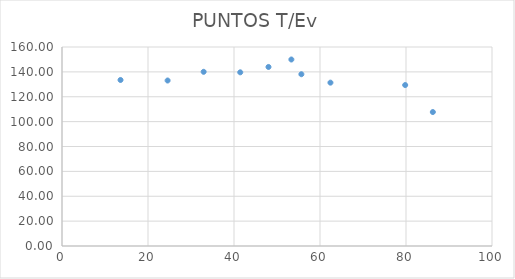
| Category | Series 0 |
|---|---|
| 55.67 | 138.109 |
| 32.94 | 140.046 |
| 53.34000000000001 | 149.946 |
| 79.81 | 129.409 |
| 62.42999999999999 | 131.332 |
| 24.56 | 133.058 |
| 41.45 | 139.636 |
| 48.02 | 143.951 |
| 13.610000000000001 | 133.485 |
| 86.24 | 107.704 |